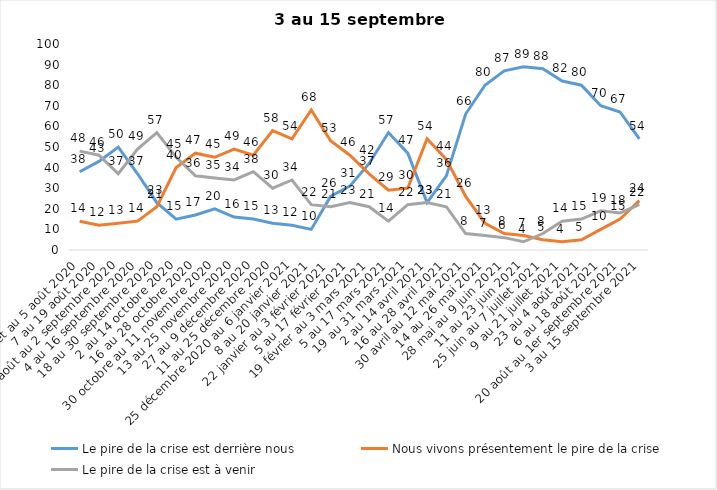
| Category | Le pire de la crise est derrière nous | Nous vivons présentement le pire de la crise | Le pire de la crise est à venir |
|---|---|---|---|
| 24 juillet au 5 août 2020 | 38 | 14 | 48 |
| 7 au 19 août 2020 | 43 | 12 | 46 |
| 21 août au 2 septembre 2020 | 50 | 13 | 37 |
| 4 au 16 septembre 2020 | 37 | 14 | 49 |
| 18 au 30 septembre 2020 | 23 | 21 | 57 |
| 2 au 14 octobre 2020 | 15 | 40 | 45 |
| 16 au 28 octobre 2020 | 17 | 47 | 36 |
| 30 octobre au 11 novembre 2020 | 20 | 45 | 35 |
| 13 au 25 novembre 2020 | 16 | 49 | 34 |
| 27 au 9 décembre 2020 | 15 | 46 | 38 |
| 11 au 25 décembre 2020 | 13 | 58 | 30 |
| 25 décembre 2020 au 6 janvier 2021 | 12 | 54 | 34 |
| 8 au 20 janvier 2021 | 10 | 68 | 22 |
| 22 janvier au 3 février 2021 | 26 | 53 | 21 |
| 5 au 17 février 2021 | 31 | 46 | 23 |
| 19 février au 3 mars 2021 | 42 | 37 | 21 |
| 5 au 17 mars 2021 | 57 | 29 | 14 |
| 19 au 31 mars 2021 | 47 | 30 | 22 |
| 2 au 14 avril 2021 | 23 | 54 | 23 |
| 16 au 28 avril 2021 | 36 | 44 | 21 |
| 30 avril au 12 mai 2021 | 66 | 26 | 8 |
| 14 au 26 mai 2021 | 80 | 13 | 7 |
| 28 mai au 9 juin 2021 | 87 | 8 | 6 |
| 11 au 23 juin 2021 | 89 | 7 | 4 |
| 25 juin au 7 juillet 2021 | 88 | 5 | 8 |
| 9 au 21 juillet 2021 | 82 | 4 | 14 |
| 23 au 4 août 2021 | 80 | 5 | 15 |
| 6 au 18 août 2021 | 70 | 10 | 19 |
| 20 août au 1er septembre 2021 | 67 | 15 | 18 |
| 3 au 15 septembre 2021 | 54 | 24 | 22 |